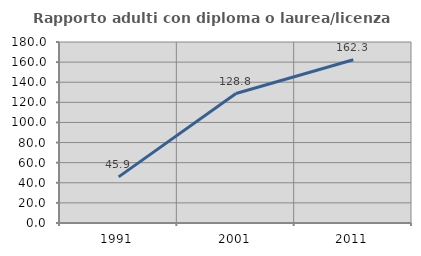
| Category | Rapporto adulti con diploma o laurea/licenza media  |
|---|---|
| 1991.0 | 45.882 |
| 2001.0 | 128.75 |
| 2011.0 | 162.319 |